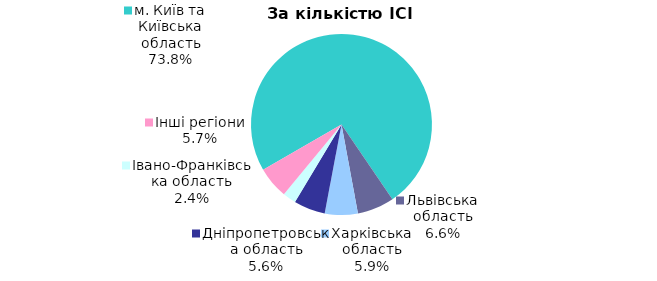
| Category | Series 0 |
|---|---|
| м. Київ та Київська область | 0.738 |
| Львівська область | 0.066 |
| Харківська область | 0.059 |
| Дніпропетровська область | 0.056 |
| Iвано-Франкiвська область | 0.024 |
| Інші регіони | 0.057 |